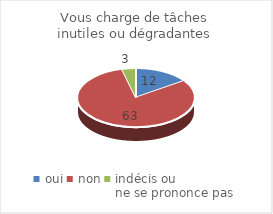
| Category | Vous charge de tâches inutiles ou dégradantes |
|---|---|
| oui | 12 |
| non | 63 |
| indécis ou 
ne se prononce pas | 3 |